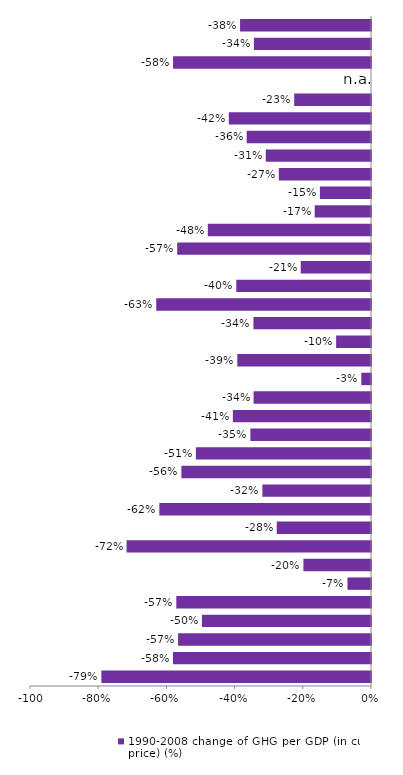
| Category | 1990-2008 change of GHG per GDP (in current price) (%) |
|---|---|
| EU-27 | -0.384 |
| EU-15 | -0.343 |
| EU-12 | -0.58 |
| Liechtenstein | 0 |
| Switzerland | -0.225 |
| Sweden | -0.417 |
| Norway | -0.365 |
| France | -0.309 |
| Austria | -0.27 |
| Spain | -0.15 |
| Italy | -0.165 |
| United Kingdom | -0.479 |
| Luxembourg | -0.568 |
| Malta | -0.206 |
| Netherlands | -0.395 |
| Latvia | -0.63 |
| Denmark | -0.345 |
| Portugal | -0.102 |
| Germany | -0.392 |
| Turkey | -0.028 |
| Belgium | -0.344 |
| Croatia | -0.405 |
| Finland | -0.354 |
| Hungary | -0.514 |
| Ireland | -0.556 |
| Slovenia | -0.319 |
| Lithuania | -0.621 |
| Greece | -0.276 |
| Slovakia | -0.717 |
| Iceland | -0.198 |
| Cyprus | -0.069 |
| Romania | -0.571 |
| Czech Republic | -0.496 |
| Poland | -0.566 |
| Bulgaria | -0.581 |
| Estonia | -0.791 |